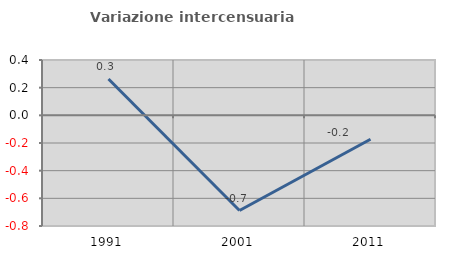
| Category | Variazione intercensuaria annua |
|---|---|
| 1991.0 | 0.263 |
| 2001.0 | -0.688 |
| 2011.0 | -0.173 |